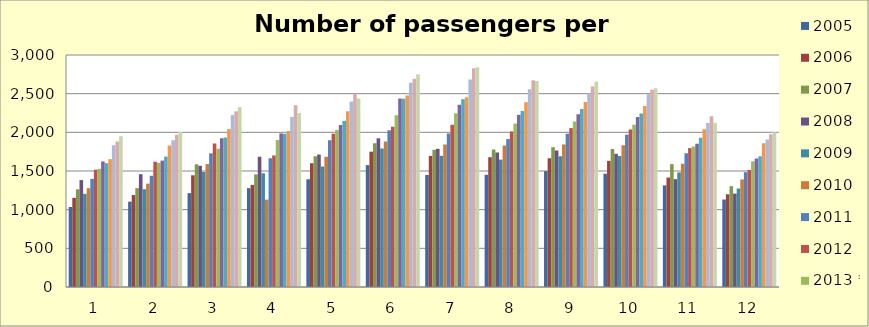
| Category | 2005 | 2006 | 2007 | 2008 | 2009 | 2010 | 2011 | 2012 | 2013 * | 2014 * | 2015 * | 2016 * | 2017 * | 2018* | 2019* |
|---|---|---|---|---|---|---|---|---|---|---|---|---|---|---|---|
| 0 | 1034.424 | 1153.153 | 1262.987 | 1382.588 | 1204.46 | 1277.431 | 1398.654 | 1517.134 | 1528.512 | 1623.426 | 1601.134 | 1653.227 | 1832.551 | 1883.011 | 1949.558 |
| 1 | 1103.819 | 1188.953 | 1278.038 | 1458.676 | 1264.674 | 1336.131 | 1438.027 | 1619.316 | 1606.085 | 1634.775 | 1686.582 | 1828.741 | 1897.819 | 1969.152 | 2004.174 |
| 2 | 1213.763 | 1444.745 | 1586.475 | 1567.709 | 1486.945 | 1589.504 | 1728.249 | 1856.95 | 1787.061 | 1924.737 | 1932.57 | 2041.887 | 2225.568 | 2271.22 | 2328.688 |
| 3 | 1277.914 | 1320.035 | 1455.819 | 1684.773 | 1470.246 | 1129.556 | 1663.289 | 1701.237 | 1901.069 | 1986.178 | 1982.163 | 2016.357 | 2199.323 | 2351.24 | 2250.468 |
| 4 | 1392.622 | 1600.333 | 1689.455 | 1712.868 | 1557.663 | 1684.236 | 1896.664 | 1980.467 | 2030.024 | 2093.526 | 2149.529 | 2272.396 | 2397.894 | 2503.814 | 2437.405 |
| 5 | 1575.777 | 1749.579 | 1859.088 | 1924.666 | 1790.873 | 1881.526 | 2026.262 | 2072.929 | 2221.978 | 2437.179 | 2434.076 | 2476.371 | 2639.823 | 2693.213 | 2751.059 |
| 6 | 1448.596 | 1693.501 | 1774.792 | 1786.997 | 1696.067 | 1842.965 | 1984.805 | 2098.723 | 2245.658 | 2356.153 | 2428.733 | 2454.546 | 2683.393 | 2828.076 | 2841.977 |
| 7 | 1451.128 | 1678.095 | 1779.074 | 1737.648 | 1647.098 | 1829.597 | 1912.966 | 2010.229 | 2113.742 | 2226.263 | 2275.353 | 2389.461 | 2556.587 | 2674.165 | 2663.975 |
| 8 | 1497.465 | 1663.548 | 1807.557 | 1764.552 | 1690.174 | 1843.333 | 1982.665 | 2054.529 | 2139.299 | 2233.715 | 2302.388 | 2393.123 | 2504.057 | 2593.107 | 2654.422 |
| 9 | 1465.179 | 1631.488 | 1783.886 | 1722.298 | 1693.565 | 1832.368 | 1969.537 | 2035.276 | 2098.319 | 2198.606 | 2243.471 | 2341.101 | 2492.708 | 2551.995 | 2568.583 |
| 10 | 1314.346 | 1415.313 | 1588.824 | 1394.845 | 1481.669 | 1594.631 | 1728.519 | 1796.099 | 1817.688 | 1852.75 | 1930.118 | 2040.655 | 2121.058 | 2207.837 | 2121.764 |
| 11 | 1131.412 | 1198.867 | 1303.521 | 1207.624 | 1273.883 | 1390.617 | 1484.429 | 1513.449 | 1625.376 | 1662.872 | 1690.642 | 1858.381 | 1906.816 | 1974.564 | 1999.987 |